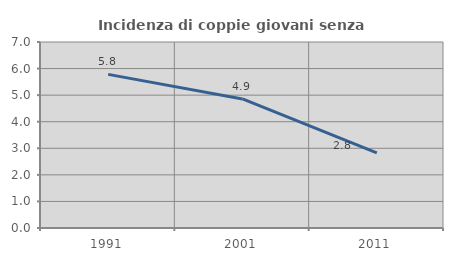
| Category | Incidenza di coppie giovani senza figli |
|---|---|
| 1991.0 | 5.782 |
| 2001.0 | 4.857 |
| 2011.0 | 2.824 |